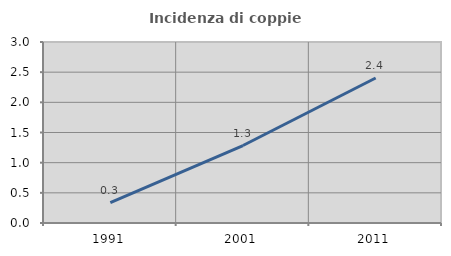
| Category | Incidenza di coppie miste |
|---|---|
| 1991.0 | 0.336 |
| 2001.0 | 1.284 |
| 2011.0 | 2.403 |